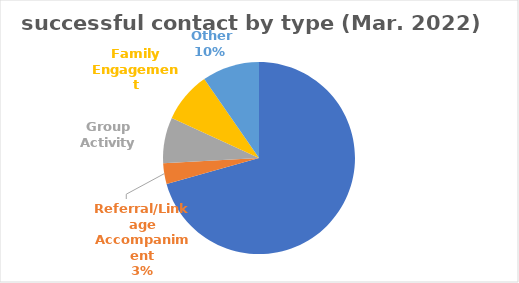
| Category | Series 0 |
|---|---|
| Individual Meeting | 183 |
| Referral/Linkage Accompaniment | 9 |
| Group Activity | 20 |
| Family Engagement | 22 |
|  Other | 25 |